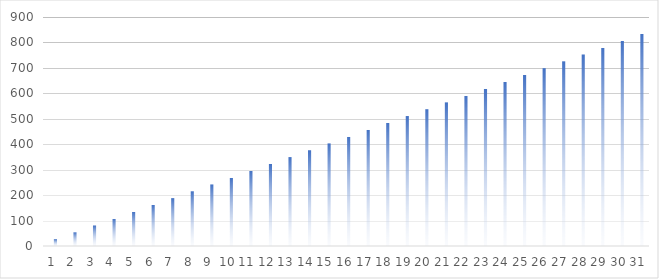
| Category | Wörter | Ziel |
|---|---|---|
| 0 | 0 | 26.882 |
| 1 | 0 | 53.763 |
| 2 | 0 | 80.645 |
| 3 | 0 | 107.527 |
| 4 | 0 | 134.409 |
| 5 | 0 | 161.29 |
| 6 | 0 | 188.172 |
| 7 | 0 | 215.054 |
| 8 | 0 | 241.935 |
| 9 | 0 | 268.817 |
| 10 | 0 | 295.699 |
| 11 | 0 | 322.581 |
| 12 | 0 | 349.462 |
| 13 | 0 | 376.344 |
| 14 | 0 | 403.226 |
| 15 | 0 | 430.108 |
| 16 | 0 | 456.989 |
| 17 | 0 | 483.871 |
| 18 | 0 | 510.753 |
| 19 | 0 | 537.634 |
| 20 | 0 | 564.516 |
| 21 | 0 | 591.398 |
| 22 | 0 | 618.28 |
| 23 | 0 | 645.161 |
| 24 | 0 | 672.043 |
| 25 | 0 | 698.925 |
| 26 | 0 | 725.806 |
| 27 | 0 | 752.688 |
| 28 | 0 | 779.57 |
| 29 | 0 | 806.452 |
| 30 | 0 | 833.333 |